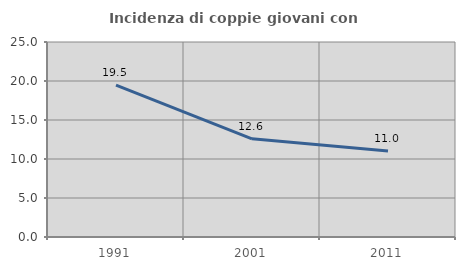
| Category | Incidenza di coppie giovani con figli |
|---|---|
| 1991.0 | 19.466 |
| 2001.0 | 12.583 |
| 2011.0 | 11.014 |